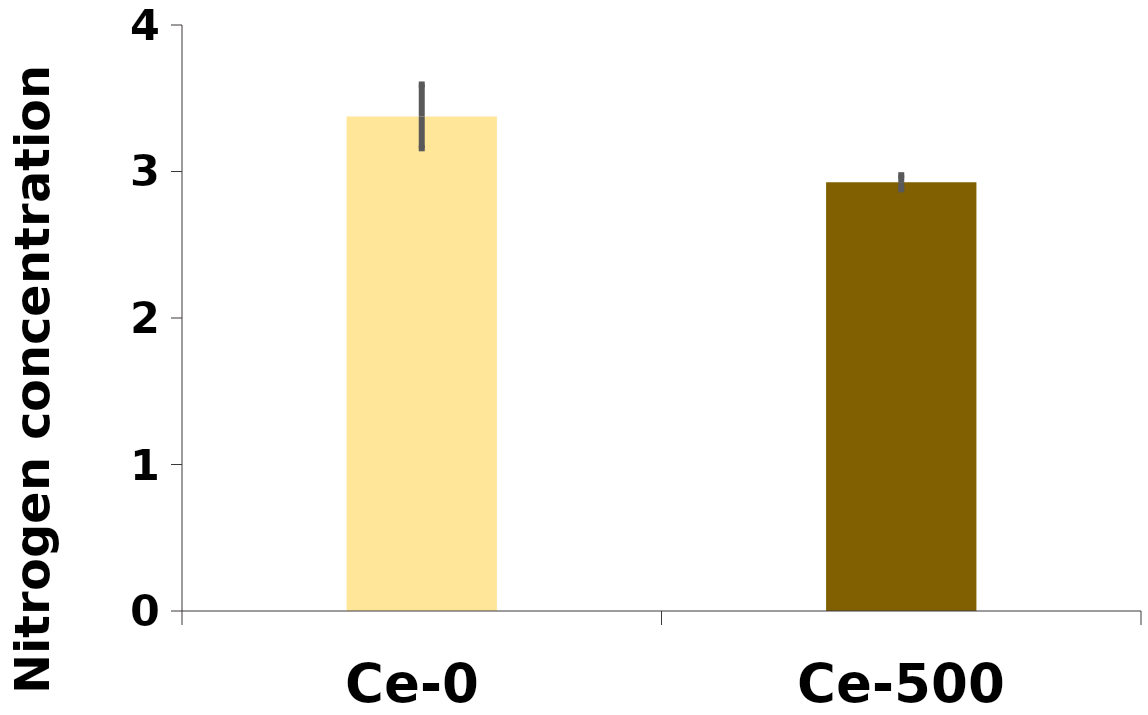
| Category | %N |
|---|---|
| Ce-0 | 3.376 |
| Ce-500 | 2.926 |